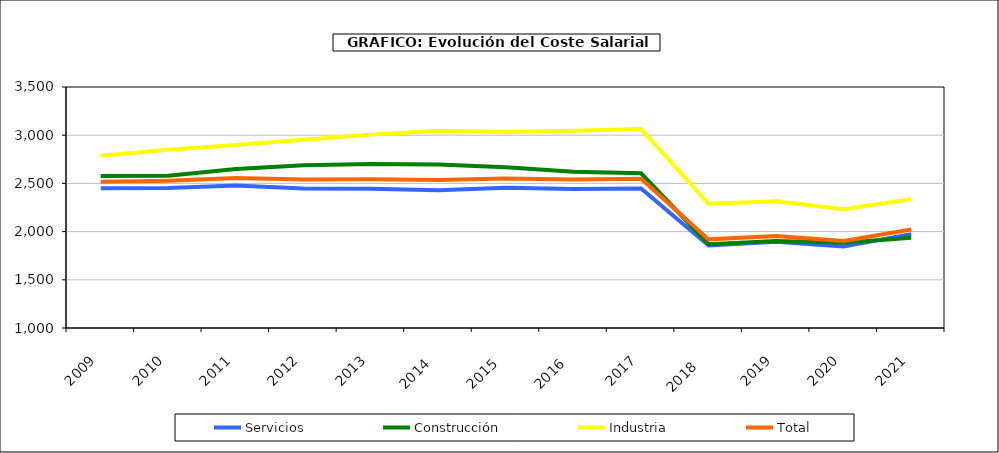
| Category | Servicios | Construcción | Industria | Total |
|---|---|---|---|---|
|  2009 | 2448.698 | 2575.892 | 2785.975 | 2516.818 |
|  2010 | 2452.875 | 2578.725 | 2848.912 | 2526.97 |
|  2011 | 2477.602 | 2649.94 | 2897.9 | 2556.79 |
|  2012 | 2446.112 | 2688.855 | 2953.138 | 2540.255 |
|  2013 | 2443.342 | 2702.31 | 3005.935 | 2544.135 |
|  2014  | 2428.98 | 2696.288 | 3044.88 | 2535.985 |
|  2015  | 2453.618 | 2667.11 | 3033.778 | 2551.698 |
|  2016  | 2442.583 | 2621.615 | 3044.992 | 2541.34 |
|  2017 | 2448.048 | 2604.682 | 3065.288 | 2547.36 |
|  2018   | 1855.958 | 1869.548 | 2289.278 | 1919.42 |
|  2019 | 1894.81 | 1901.285 | 2315.172 | 1955.188 |
|  2020 | 1846.728 | 1885.358 | 2231.732 | 1903.575 |
|  2021 | 1973.51 | 1935.08 | 2334.69 | 2022.59 |